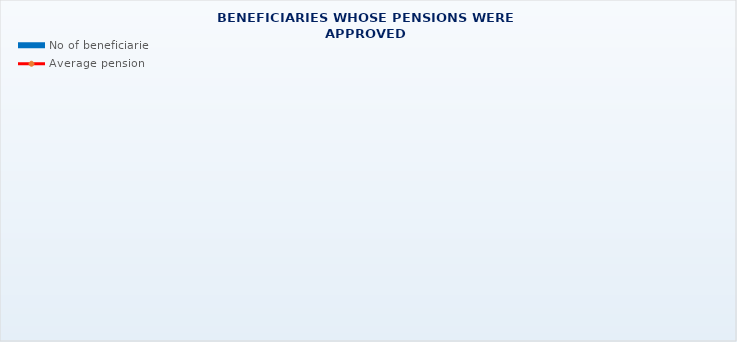
| Category | No of beneficiaries |
|---|---|
| Authorised officials in internal affairs, judicial officers and workers engaged in demining work: | 17264 |
| Pension beneficiaries entitled under the Fire Services Act (Official Gazette 125/19)* | 29 |
| Active military personnel - DVO  | 15804 |
| Croatian Homeland Army veterans mobilised from 1941 to 1945 | 3682 |
| Former political prisoners | 2733 |
| Croatian Veterans from the Homeland War - ZOHBDR (Act on Croatian Homeland War Veterans and Their Family Members) | 71160 |
| Pensions approved under general regulations and determined according to the Act on the Rights of Croatian Homeland War Veterans and their Family Members (ZOHBDR), in 2017 (Art. 27, 35, 48 and 49, paragraph 2)    | 45184 |
| Former Yugoslav People's Army members - JNA   | 5150 |
| Former Yugoslav People's Army members - JNA - Art. 185 of Pension Insurance Act (ZOMO)  | 149 |
| National Liberation War veterans - NOR | 8849 |
| Members of the Croatian Parliament, members of the Government, judges of the Constitutional Court and the Auditor General | 676 |
| Members of the Parliamentary Executive Council and administratively retired federal civil servants  (relates to the former SFRY) | 92 |
| Former officials of federal bodies o the former SFRJ -  Article 38 of the Pension Insurance Act (ZOMO) | 31 |
| Full members of the Croatian Academy of Sciences and Arts - HAZU | 136 |
| Miners from the Istrian coal mines "Tupljak" d.d. Labin  | 254 |
| Workers professionally exposed to asbestos | 860 |
| Insurees - crew members on a ship in international and national navigation  - Article  129, paragraph 2 of the Maritime Code | 182 |
| Members of the Croatian Defence Council - HVO  | 6749 |